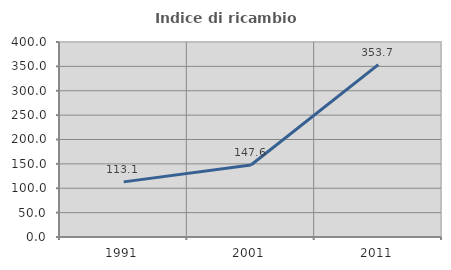
| Category | Indice di ricambio occupazionale  |
|---|---|
| 1991.0 | 113.077 |
| 2001.0 | 147.619 |
| 2011.0 | 353.704 |